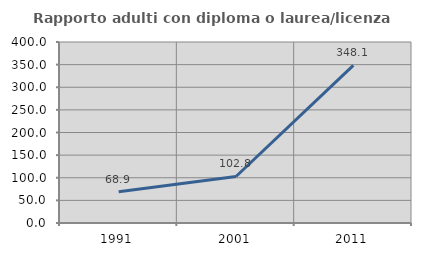
| Category | Rapporto adulti con diploma o laurea/licenza media  |
|---|---|
| 1991.0 | 68.852 |
| 2001.0 | 102.817 |
| 2011.0 | 348.148 |